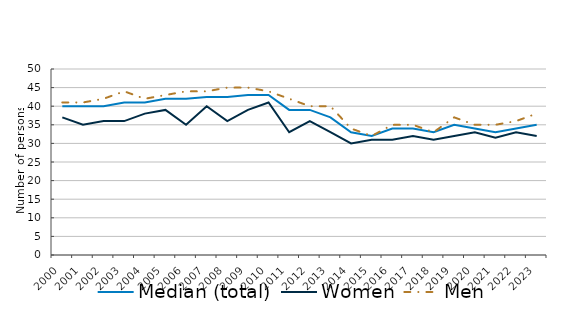
| Category | Median (total) | Women | Men |
|---|---|---|---|
| 2000.0 | 40 | 37 | 41 |
| 2001.0 | 40 | 35 | 41 |
| 2002.0 | 40 | 36 | 42 |
| 2003.0 | 41 | 36 | 44 |
| 2004.0 | 41 | 38 | 42 |
| 2005.0 | 42 | 39 | 43 |
| 2006.0 | 42 | 35 | 44 |
| 2007.0 | 42.5 | 40 | 44 |
| 2008.0 | 42.5 | 36 | 45 |
| 2009.0 | 43 | 39 | 45 |
| 2010.0 | 43 | 41 | 44 |
| 2011.0 | 39 | 33 | 42 |
| 2012.0 | 39 | 36 | 40 |
| 2013.0 | 37 | 33 | 40 |
| 2014.0 | 33 | 30 | 34 |
| 2015.0 | 32 | 31 | 32 |
| 2016.0 | 34 | 31 | 35 |
| 2017.0 | 34 | 32 | 35 |
| 2018.0 | 33 | 31 | 33 |
| 2019.0 | 35 | 32 | 37 |
| 2020.0 | 34 | 33 | 35 |
| 2021.0 | 33 | 31.5 | 35 |
| 2022.0 | 34 | 33 | 36 |
| 2023.0 | 35 | 32 | 38 |